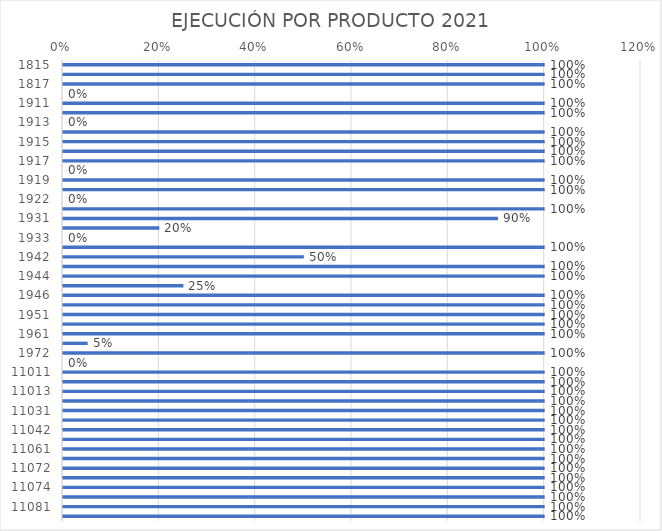
| Category | Series 0 |
|---|---|
| 1815.0 | 1 |
| 1816.0 | 1 |
| 1817.0 | 1 |
| 1818.0 | 0 |
| 1911.0 | 1 |
| 1912.0 | 1 |
| 1913.0 | 0 |
| 1914.0 | 1 |
| 1915.0 | 1 |
| 1916.0 | 1 |
| 1917.0 | 1 |
| 1918.0 | 0 |
| 1919.0 | 1 |
| 1921.0 | 1 |
| 1922.0 | 0 |
| 1923.0 | 1 |
| 1931.0 | 0.903 |
| 1932.0 | 0.2 |
| 1933.0 | 0 |
| 1941.0 | 1 |
| 1942.0 | 0.5 |
| 1943.0 | 1 |
| 1944.0 | 1 |
| 1945.0 | 0.25 |
| 1946.0 | 1 |
| 1947.0 | 1 |
| 1951.0 | 1 |
| 1952.0 | 1 |
| 1961.0 | 1 |
| 1971.0 | 0.051 |
| 1972.0 | 1 |
| 1973.0 | 0 |
| 11011.0 | 1 |
| 11012.0 | 1 |
| 11013.0 | 1 |
| 11021.0 | 1 |
| 11031.0 | 1 |
| 11041.0 | 1 |
| 11042.0 | 1 |
| 11051.0 | 1 |
| 11061.0 | 1 |
| 11071.0 | 1 |
| 11072.0 | 1 |
| 11073.0 | 1 |
| 11074.0 | 1 |
| 11076.0 | 1 |
| 11081.0 | 1 |
| 11082.0 | 1 |